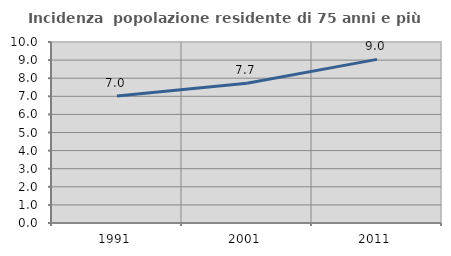
| Category | Incidenza  popolazione residente di 75 anni e più |
|---|---|
| 1991.0 | 7.012 |
| 2001.0 | 7.72 |
| 2011.0 | 9.04 |